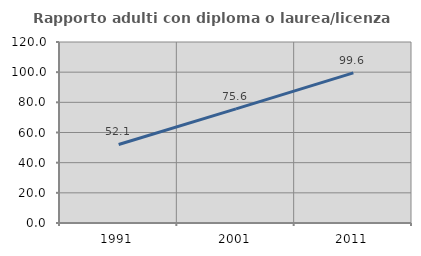
| Category | Rapporto adulti con diploma o laurea/licenza media  |
|---|---|
| 1991.0 | 52.057 |
| 2001.0 | 75.634 |
| 2011.0 | 99.559 |